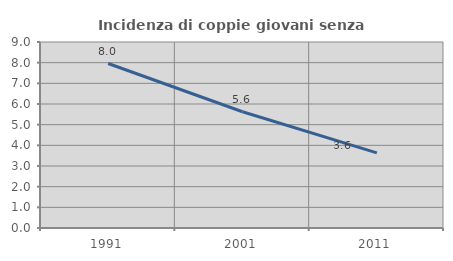
| Category | Incidenza di coppie giovani senza figli |
|---|---|
| 1991.0 | 7.958 |
| 2001.0 | 5.626 |
| 2011.0 | 3.632 |